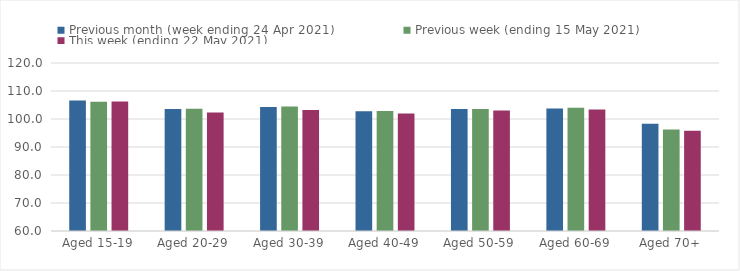
| Category | Previous month (week ending 24 Apr 2021) | Previous week (ending 15 May 2021) | This week (ending 22 May 2021) |
|---|---|---|---|
| Aged 15-19 | 106.6 | 106.17 | 106.22 |
| Aged 20-29 | 103.55 | 103.66 | 102.35 |
| Aged 30-39 | 104.32 | 104.45 | 103.17 |
| Aged 40-49 | 102.79 | 102.84 | 102 |
| Aged 50-59 | 103.57 | 103.6 | 103.06 |
| Aged 60-69 | 103.76 | 104.01 | 103.39 |
| Aged 70+ | 98.26 | 96.22 | 95.77 |